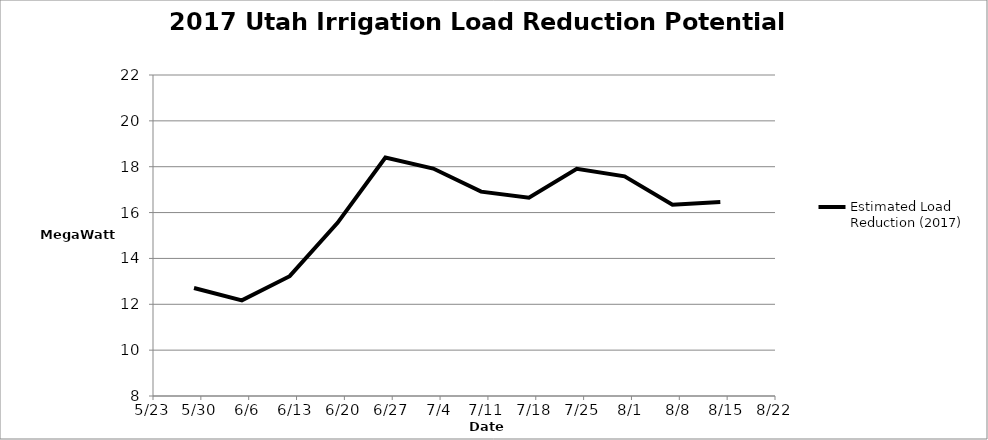
| Category | Estimated Load Reduction (2017) |
|---|---|
| 42519.0 | 12.711 |
| 42526.0 | 12.172 |
| 42533.0 | 13.226 |
| 42540.0 | 15.553 |
| 42547.0 | 18.4 |
| 42554.0 | 17.921 |
| 42561.0 | 16.914 |
| 42568.0 | 16.646 |
| 42575.0 | 17.909 |
| 42582.0 | 17.582 |
| 42589.0 | 16.345 |
| 42596.0 | 16.457 |